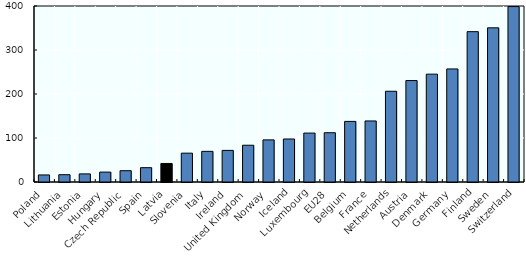
| Category | Series 0 |
|---|---|
| Poland | 16.02 |
| Lithuania | 16.61 |
| Estonia | 18.42 |
| Hungary | 22.51 |
| Czech Republic | 25.68 |
| Spain | 32.54 |
| Latvia | 42.12 |
| Slovenia | 65.54 |
| Italy | 69.67 |
| Ireland | 71.83 |
| United Kingdom | 83.58 |
| Norway | 95.73 |
| Iceland | 97.74 |
| Luxembourg | 111.16 |
| EU28 | 111.97 |
| Belgium | 137.73 |
| France | 138.74 |
| Netherlands | 206.23 |
| Austria | 230.54 |
| Denmark | 245.12 |
| Germany | 256.97 |
| Finland | 341.72 |
| Sweden | 350.41 |
| Switzerland | 398.67 |